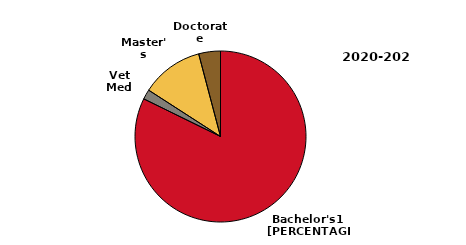
| Category | 2020-2021 |
|---|---|
| Bachelor's1 | 6546 |
| Vet Med | 148 |
| Master's | 937 |
| Doctorate | 327 |